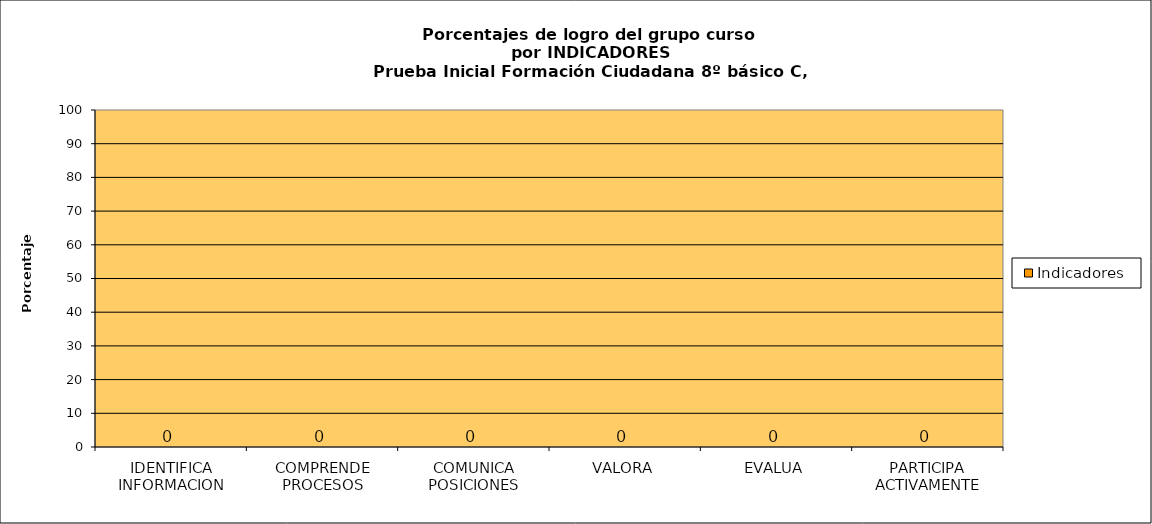
| Category | Indicadores |
|---|---|
| IDENTIFICA INFORMACION | 0 |
| COMPRENDE PROCESOS | 0 |
| COMUNICA POSICIONES | 0 |
| VALORA | 0 |
| EVALUA | 0 |
| PARTICIPA ACTIVAMENTE | 0 |